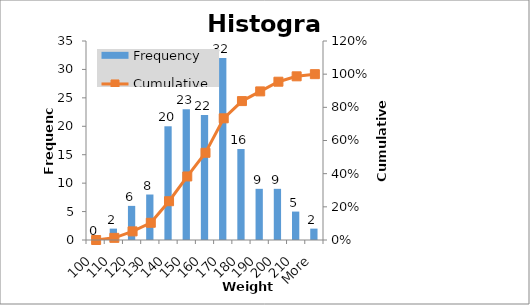
| Category | Frequency |
|---|---|
| 100 | 0 |
| 110 | 2 |
| 120 | 6 |
| 130 | 8 |
| 140 | 20 |
| 150 | 23 |
| 160 | 22 |
| 170 | 32 |
| 180 | 16 |
| 190 | 9 |
| 200 | 9 |
| 210 | 5 |
| More | 2 |